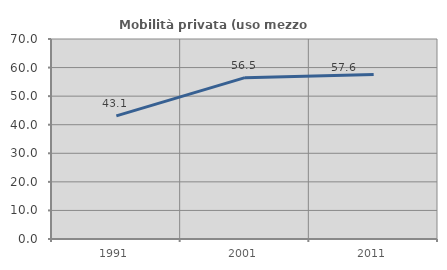
| Category | Mobilità privata (uso mezzo privato) |
|---|---|
| 1991.0 | 43.1 |
| 2001.0 | 56.474 |
| 2011.0 | 57.595 |